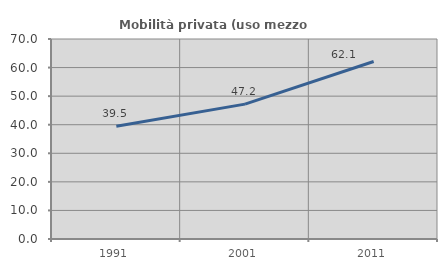
| Category | Mobilità privata (uso mezzo privato) |
|---|---|
| 1991.0 | 39.488 |
| 2001.0 | 47.206 |
| 2011.0 | 62.131 |